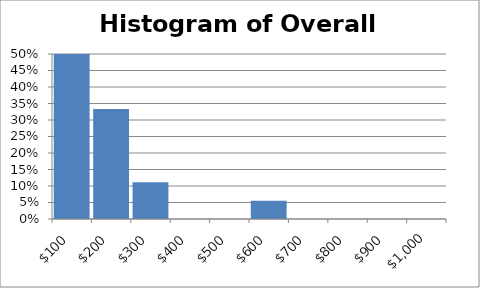
| Category | Series 0 |
|---|---|
| 100.0 | 0.5 |
| 200.0 | 0.333 |
| 300.0 | 0.111 |
| 400.0 | 0 |
| 500.0 | 0 |
| 600.0 | 0.056 |
| 700.0 | 0 |
| 800.0 | 0 |
| 900.0 | 0 |
| 1000.0 | 0 |